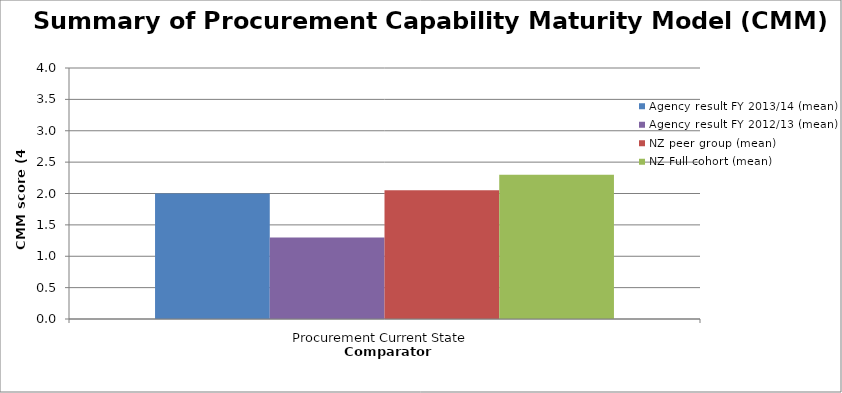
| Category | Agency result FY 2013/14 (mean) | Agency result FY 2012/13 (mean) | NZ peer group (mean) | NZ Full cohort (mean) |
|---|---|---|---|---|
| Procurement Current State | 2 | 1.3 | 2.05 | 2.3 |